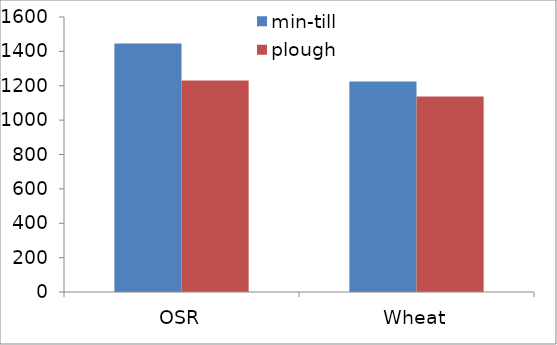
| Category | min-till | plough |
|---|---|---|
| OSR | 1445.44 | 1230.269 |
| Wheat | 1224.616 | 1137.627 |